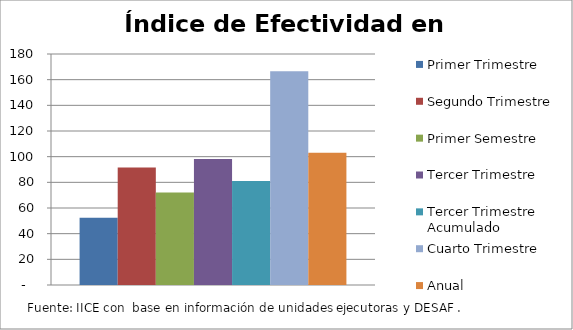
| Category | Primer Trimestre | Segundo Trimestre | Primer Semestre | Tercer Trimestre | Tercer Trimestre Acumulado | Cuarto Trimestre | Anual |
|---|---|---|---|---|---|---|---|
| 0 | 52.406 | 91.476 | 72.137 | 98.113 | 80.983 | 166.55 | 103.121 |